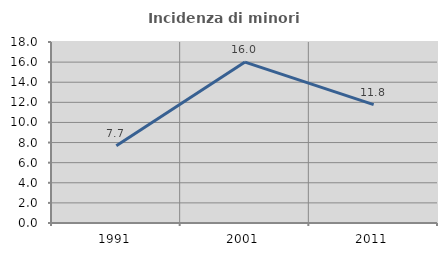
| Category | Incidenza di minori stranieri |
|---|---|
| 1991.0 | 7.692 |
| 2001.0 | 16 |
| 2011.0 | 11.765 |